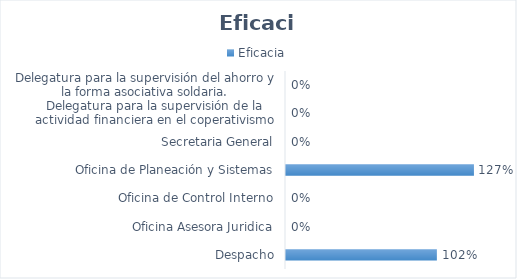
| Category | Eficacia |
|---|---|
| Despacho | 1.019 |
| Oficina Asesora Juridica | 0 |
| Oficina de Control Interno | 0 |
| Oficina de Planeación y Sistemas | 1.27 |
| Secretaria General | 0 |
| Delegatura para la supervisión de la actividad financiera en el coperativismo | 0 |
| Delegatura para la supervisión del ahorro y la forma asociativa soldaria. | 0 |